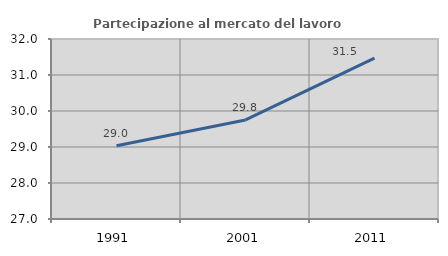
| Category | Partecipazione al mercato del lavoro  femminile |
|---|---|
| 1991.0 | 29.034 |
| 2001.0 | 29.751 |
| 2011.0 | 31.471 |